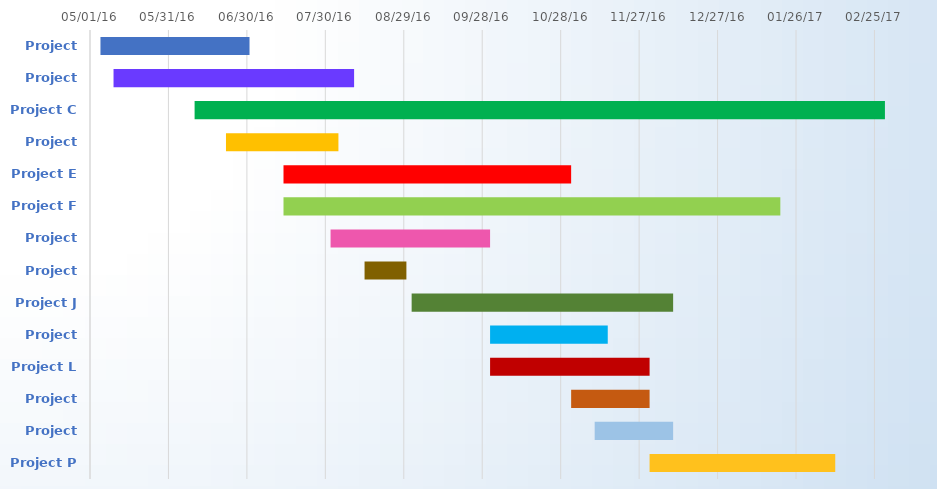
| Category | BEGIN | Duration |
|---|---|---|
| Project A | 2016-05-05 | 57 |
| Project B | 2016-05-10 | 92 |
| Project C | 2016-06-10 | 264 |
| Project D | 2016-06-22 | 43 |
| Project E | 2016-07-14 | 110 |
| Project F | 2016-07-14 | 190 |
| Project G | 2016-08-01 | 61 |
| Project H | 2016-08-14 | 16 |
| Project J | 2016-09-01 | 100 |
| Project K | 2016-10-01 | 45 |
| Project L | 2016-10-01 | 61 |
| Project M | 2016-11-01 | 30 |
| Project N | 2016-11-10 | 30 |
| Project P | 2016-12-01 | 71 |